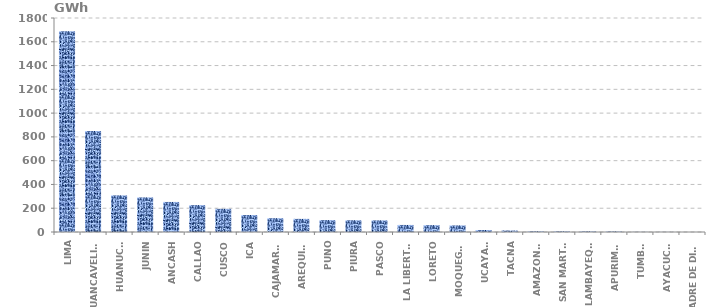
| Category | Series 0 |
|---|---|
| LIMA | 1689.566 |
| HUANCAVELICA | 848.655 |
| HUANUCO | 308.06 |
| JUNIN | 290.901 |
| ANCASH | 252.791 |
| CALLAO | 226.239 |
| CUSCO | 194.877 |
| ICA | 143.146 |
| CAJAMARCA | 116.129 |
| AREQUIPA | 110.378 |
| PUNO | 100.05 |
| PIURA | 98.827 |
| PASCO | 97.84 |
| LA LIBERTAD | 59.339 |
| LORETO | 57.668 |
| MOQUEGUA | 55.424 |
| UCAYALI | 16.69 |
| TACNA | 12.524 |
| AMAZONAS | 5.685 |
| SAN MARTÍN | 5.486 |
| LAMBAYEQUE | 5.181 |
| APURIMAC | 4.364 |
| TUMBES | 1.114 |
| AYACUCHO | 0.765 |
| MADRE DE DIOS | 0.154 |